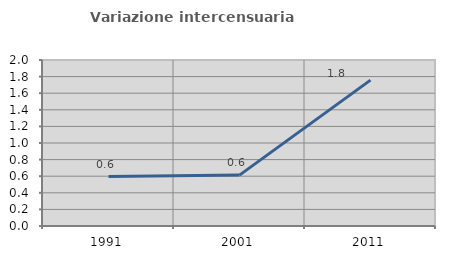
| Category | Variazione intercensuaria annua |
|---|---|
| 1991.0 | 0.595 |
| 2001.0 | 0.613 |
| 2011.0 | 1.758 |